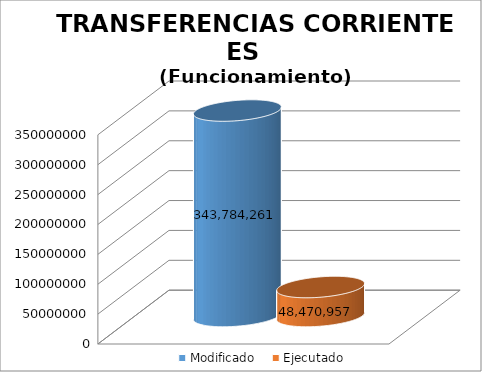
| Category | Modificado | Ejecutado |
|---|---|---|
| 0 | 343784261 | 48470956.96 |